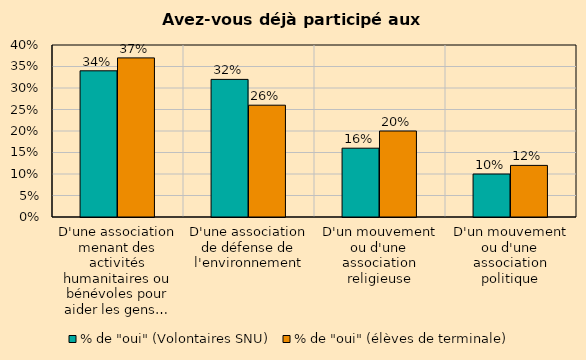
| Category | % de "oui" (Volontaires SNU) | % de "oui" (élèves de terminale) |
|---|---|---|
| D'une association menant des activités humanitaires ou bénévoles pour aider les gens… | 0.34 | 0.37 |
| D'une association de défense de l'environnement | 0.32 | 0.26 |
| D'un mouvement ou d'une association religieuse | 0.16 | 0.2 |
| D'un mouvement ou d'une association politique | 0.1 | 0.12 |